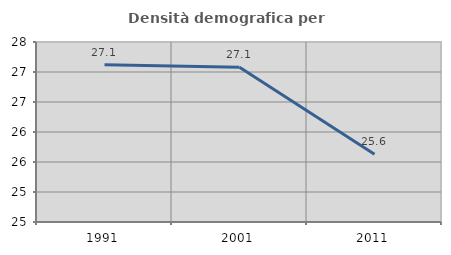
| Category | Densità demografica |
|---|---|
| 1991.0 | 27.12 |
| 2001.0 | 27.079 |
| 2011.0 | 25.63 |